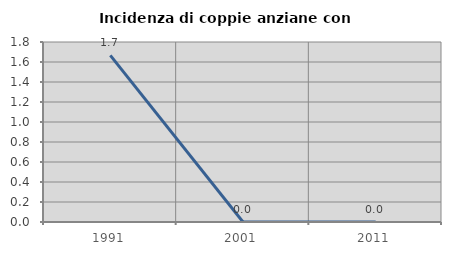
| Category | Incidenza di coppie anziane con figli |
|---|---|
| 1991.0 | 1.667 |
| 2001.0 | 0 |
| 2011.0 | 0 |